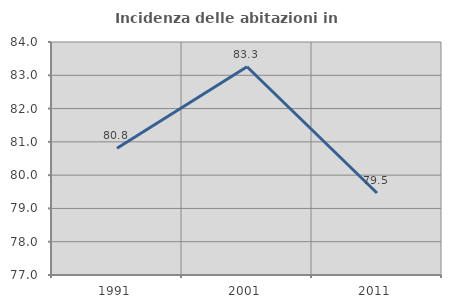
| Category | Incidenza delle abitazioni in proprietà  |
|---|---|
| 1991.0 | 80.809 |
| 2001.0 | 83.256 |
| 2011.0 | 79.463 |